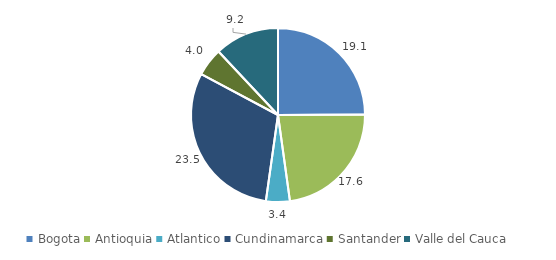
| Category | Series 0 |
|---|---|
| Bogota | 19.135 |
| Antioquia | 17.584 |
| Atlantico | 3.4 |
| Cundinamarca | 23.473 |
| Santander | 4.014 |
| Valle del Cauca | 9.208 |